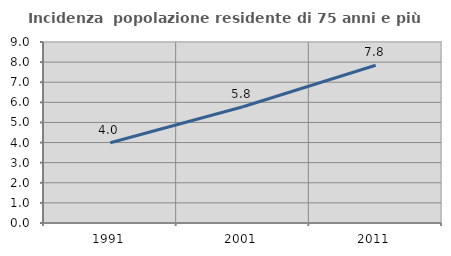
| Category | Incidenza  popolazione residente di 75 anni e più |
|---|---|
| 1991.0 | 3.989 |
| 2001.0 | 5.778 |
| 2011.0 | 7.844 |